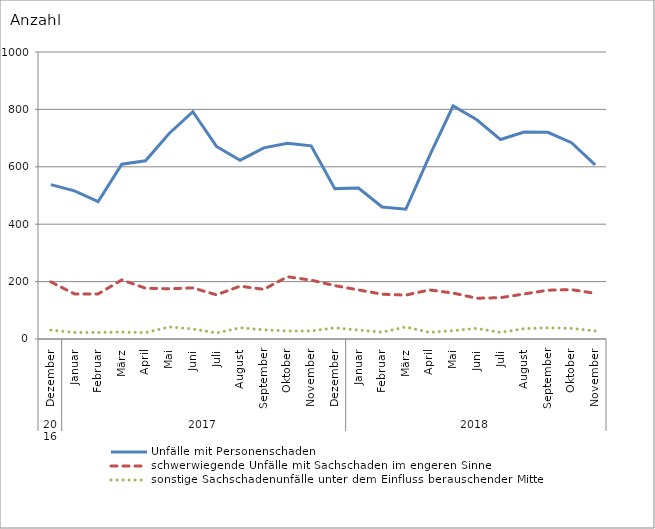
| Category | Unfälle mit Personenschaden | schwerwiegende Unfälle mit Sachschaden im engeren Sinne | sonstige Sachschadenunfälle unter dem Einfluss berauschender Mittel |
|---|---|---|---|
| 0 | 538 | 199 | 31 |
| 1 | 516 | 157 | 23 |
| 2 | 479 | 157 | 23 |
| 3 | 609 | 206 | 24 |
| 4 | 621 | 177 | 22 |
| 5 | 716 | 175 | 42 |
| 6 | 792 | 178 | 35 |
| 7 | 671 | 154 | 21 |
| 8 | 623 | 184 | 39 |
| 9 | 666 | 173 | 32 |
| 10 | 682 | 217 | 28 |
| 11 | 673 | 205 | 28 |
| 12 | 524 | 186 | 39 |
| 13 | 526 | 171 | 31 |
| 14 | 460 | 156 | 24 |
| 15 | 452 | 153 | 42 |
| 16 | 638 | 171 | 23 |
| 17 | 812 | 160 | 29 |
| 18 | 764 | 142 | 37 |
| 19 | 695 | 144 | 23 |
| 20 | 721 | 157 | 36 |
| 21 | 720 | 170 | 39 |
| 22 | 684 | 172 | 37 |
| 23 | 607 | 159 | 28 |